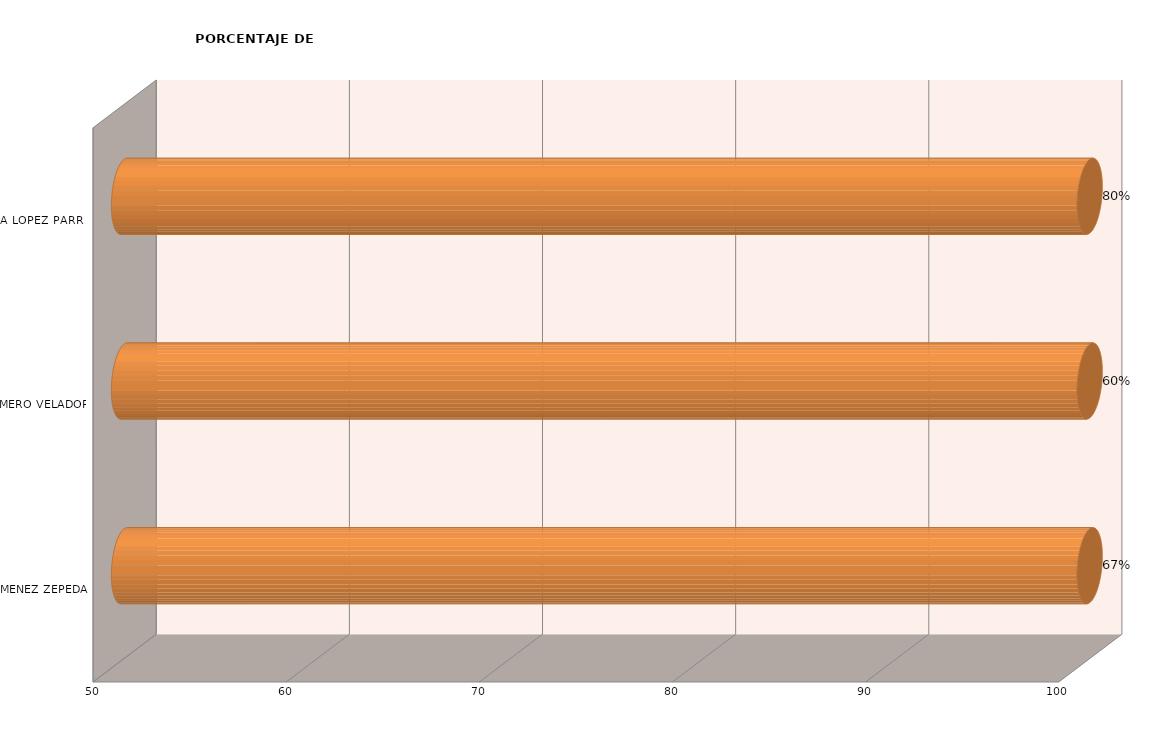
| Category | Series 0 |
|---|---|
| ALEJANDRA JIMENEZ ZEPEDA | 100 |
| BONIFACIO ROMERO VELADOR | 100 |
| MARIA YOLANDA LOPEZ PARRA | 100 |